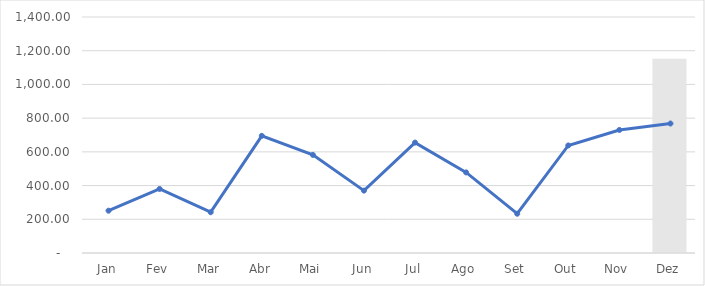
| Category | Destaque |
|---|---|
| Jan | 0 |
| Fev | 0 |
| Mar | 0 |
| Abr | 0 |
| Mai | 0 |
| Jun | 0 |
| Jul | 0 |
| Ago | 0 |
| Set | 0 |
| Out | 0 |
| Nov | 0 |
| Dez | 1152 |